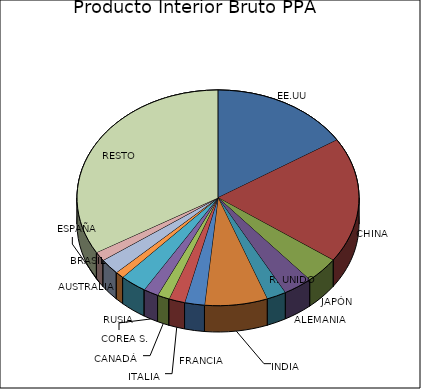
| Category | Series 0 |
|---|---|
| EE.UU | 22675 |
| CHINA | 26657 |
| JAPÓN | 5586 |
| ALEMANIA | 4744 |
| R. UNIDO | 3175 |
| INDIA | 10207 |
| FRANCIA | 3232 |
| ITALIA | 2611 |
| CANADÁ | 1979 |
| COREA S. | 2437 |
| RUSIA | 4328 |
| AUSTRALIA | 1416 |
| BRASIL | 3328 |
| ESPAÑA | 1959 |
| RESTO | 47422 |